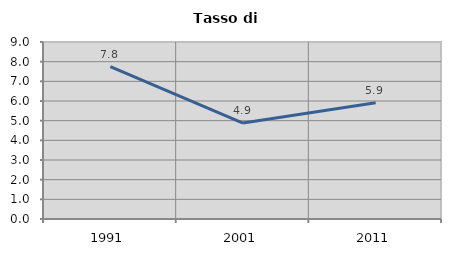
| Category | Tasso di disoccupazione   |
|---|---|
| 1991.0 | 7.752 |
| 2001.0 | 4.877 |
| 2011.0 | 5.912 |